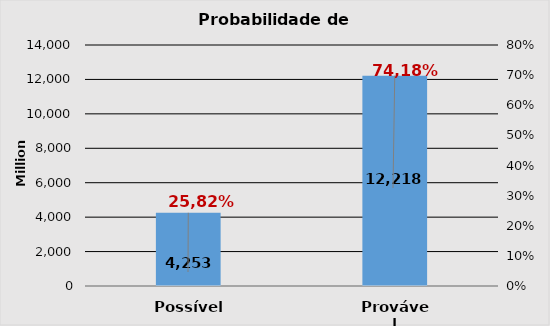
| Category | Series 0 |
|---|---|
| Possível | 4252566317.32 |
| Provável | 12217742304.27 |